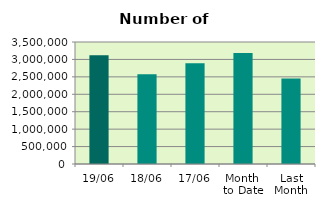
| Category | Series 0 |
|---|---|
| 19/06 | 3121774 |
| 18/06 | 2574628 |
| 17/06 | 2887610 |
| Month 
to Date | 3183004.8 |
| Last
Month | 2451339.2 |